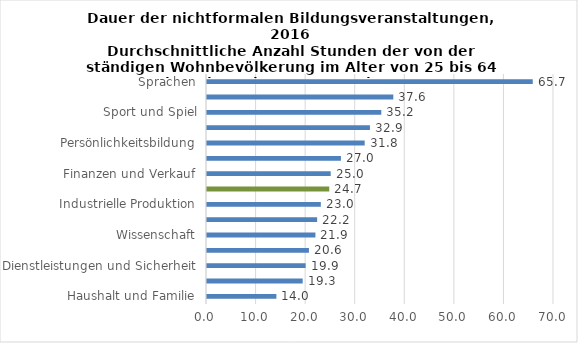
| Category | 2016 |
|---|---|
| Haushalt und Familie | 14 |
| Landwirtschaft | 19.302 |
| Dienstleistungen und Sicherheit | 19.896 |
| Pädagogik | 20.562 |
| Wissenschaft | 21.871 |
| Gesundheit und Medizin | 22.216 |
| Industrielle Produktion | 22.959 |
| Informatik | 24.66 |
| Finanzen und Verkauf | 24.952 |
| Künstlerische und kreative Aktivitäten | 27.02 |
| Persönlichkeitsbildung | 31.811 |
| Kaderkurse | 32.872 |
| Sport und Spiel | 35.161 |
| Andere | 37.587 |
| Sprachen | 65.715 |